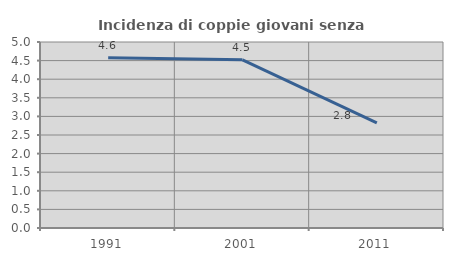
| Category | Incidenza di coppie giovani senza figli |
|---|---|
| 1991.0 | 4.574 |
| 2001.0 | 4.521 |
| 2011.0 | 2.825 |